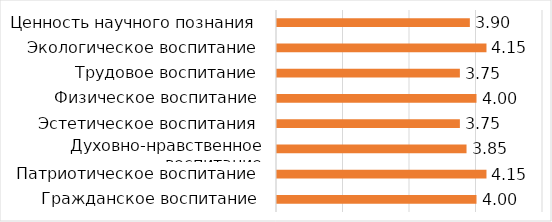
| Category | Series 1 |
|---|---|
| Гражданское воспитание | 4 |
| Патриотическое воспитание | 4.15 |
| Духовно-нравственное воспитание | 3.85 |
| Эстетическое воспитания | 3.75 |
| Физическое воспитание | 4 |
| Трудовое воспитание | 3.75 |
| Экологическое воспитание | 4.15 |
| Ценность научного познания | 3.9 |